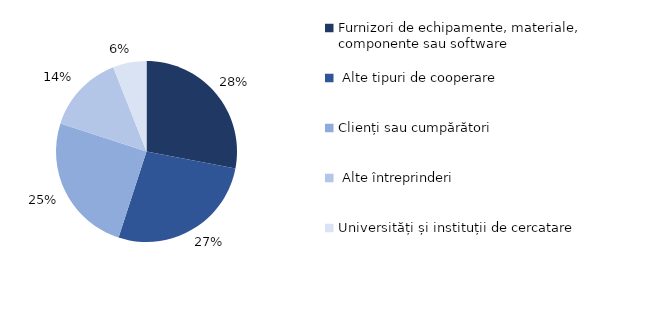
| Category | Series 0 |
|---|---|
| Furnizori de echipamente, materiale, componente sau software | 0.28 |
|  Alte tipuri de cooperare | 0.27 |
| Clienți sau cumpărători  | 0.25 |
|  Alte întreprinderi  | 0.14 |
| Universități și instituții de cercatare | 0.06 |